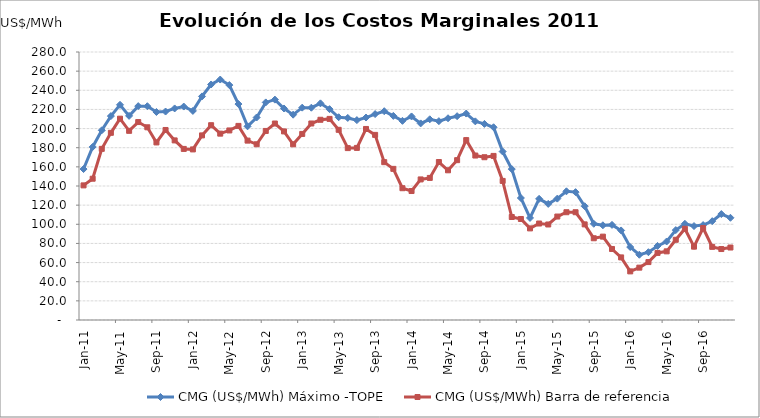
| Category | CMG (US$/MWh) Máximo -TOPE | CMG (US$/MWh) Barra de referencia |
|---|---|---|
| 2011-01-01 | 157.708 | 140.639 |
| 2011-02-01 | 180.807 | 147.614 |
| 2011-03-01 | 198.184 | 178.814 |
| 2011-04-01 | 213.042 | 195.562 |
| 2011-05-01 | 224.834 | 210.332 |
| 2011-06-01 | 213.27 | 197.63 |
| 2011-07-01 | 223.438 | 206.806 |
| 2011-08-01 | 223.369 | 201.332 |
| 2011-09-01 | 217.323 | 185.522 |
| 2011-10-01 | 217.803 | 198.535 |
| 2011-11-01 | 221.02 | 187.636 |
| 2011-12-01 | 223.002 | 178.745 |
| 2012-01-01 | 218.47 | 178.223 |
| 2012-02-01 | 233.6 | 192.871 |
| 2012-03-01 | 246.07 | 203.53 |
| 2012-04-01 | 251.23 | 194.688 |
| 2012-05-01 | 245.44 | 198.046 |
| 2012-06-01 | 225.62 | 202.791 |
| 2012-07-01 | 202.35 | 187.407 |
| 2012-08-01 | 211.59 | 183.594 |
| 2012-09-01 | 227.33 | 197.519 |
| 2012-10-01 | 230.25 | 205.275 |
| 2012-11-01 | 220.99 | 197.03 |
| 2012-12-01 | 214.51 | 183.538 |
| 2013-01-01 | 221.86 | 194.4 |
| 2013-02-01 | 221.79 | 205.3 |
| 2013-03-01 | 226.35 | 209.2 |
| 2013-04-01 | 220.3 | 210.1 |
| 2013-05-01 | 211.83 | 198.7 |
| 2013-06-01 | 211.1 | 179.6 |
| 2013-07-01 | 208.84 | 179.8 |
| 2013-08-01 | 211.53 | 199.6 |
| 2013-09-01 | 215.15 | 193.4 |
| 2013-10-01 | 218.13 | 164.9 |
| 2013-11-01 | 213.24 | 157.9 |
| 2013-12-01 | 208.06 | 137.696 |
| 2014-01-01 | 212.67 | 134.746 |
| 2014-02-01 | 205.39 | 146.869 |
| 2014-03-01 | 209.7 | 148.45 |
| 2014-04-01 | 207.76 | 165.047 |
| 2014-05-01 | 210.78 | 156.398 |
| 2014-06-01 | 212.95 | 166.999 |
| 2014-07-01 | 215.69 | 187.953 |
| 2014-08-01 | 207.54 | 171.817 |
| 2014-09-01 | 204.87 | 170.068 |
| 2014-10-01 | 201.37 | 171.429 |
| 2014-11-01 | 176 | 145.313 |
| 2014-12-01 | 157.67 | 107.601 |
| 2015-01-01 | 127.47 | 105.546 |
| 2015-02-01 | 106.63 | 95.7 |
| 2015-03-01 | 126.58 | 100.8 |
| 2015-04-01 | 121.28 | 99.8 |
| 2015-05-01 | 126.82 | 108.1 |
| 2015-06-01 | 134.46 | 112.6 |
| 2015-07-01 | 133.6 | 112.6 |
| 2015-08-01 | 118.86 | 99.9 |
| 2015-09-01 | 100.53 | 85.4 |
| 2015-10-01 | 98.95 | 87.1 |
| 2015-11-01 | 99.37 | 74.2 |
| 2015-12-01 | 93.56 | 65.4 |
| 2016-01-01 | 76.21 | 50.8 |
| 2016-02-01 | 68.18 | 54.7 |
| 2016-03-01 | 70.84 | 60.5 |
| 2016-04-01 | 77.38 | 70.1 |
| 2016-05-01 | 82.03 | 71.721 |
| 2016-06-01 | 93.93 | 83.82 |
| 2016-07-01 | 100.51 | 95.331 |
| 2016-08-01 | 98.15 | 76.631 |
| 2016-09-01 | 99.18 | 96.113 |
| 2016-10-01 | 103.27 | 76.417 |
| 2016-11-01 | 110.67 | 74.137 |
| 2016-12-01 | 106.79 | 75.724 |